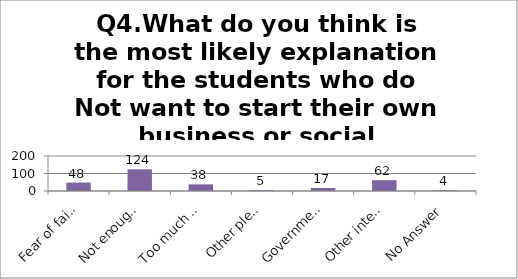
| Category | Q4.What do you think is the most likely explanation for the students who do Not want to start their own business or social enterprise? |
|---|---|
| Fear of faiulure | 48 |
| Not enough money to get a business started | 124 |
| Too much work | 38 |
| Other please specify | 5 |
| Government obstacles | 17 |
| Other interests | 62 |
| No Answer | 4 |